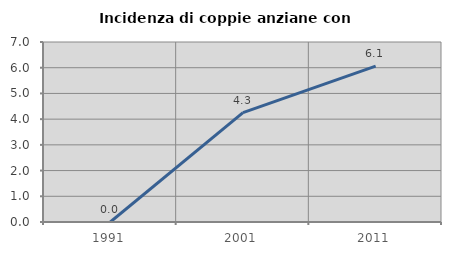
| Category | Incidenza di coppie anziane con figli |
|---|---|
| 1991.0 | 0 |
| 2001.0 | 4.255 |
| 2011.0 | 6.061 |